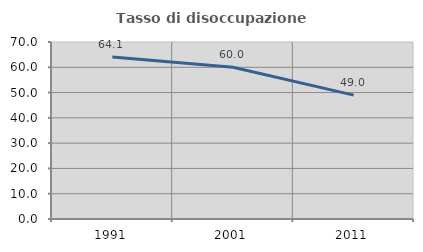
| Category | Tasso di disoccupazione giovanile  |
|---|---|
| 1991.0 | 64.093 |
| 2001.0 | 60 |
| 2011.0 | 48.98 |